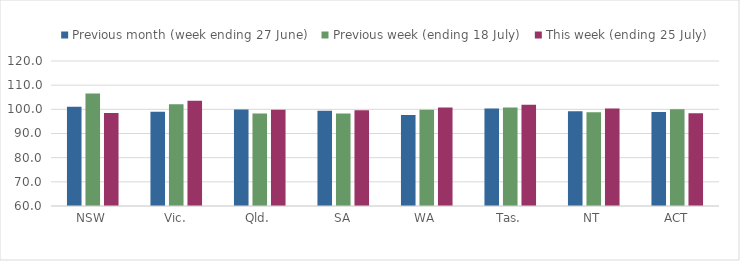
| Category | Previous month (week ending 27 June) | Previous week (ending 18 July) | This week (ending 25 July) |
|---|---|---|---|
| NSW | 101.058 | 106.523 | 98.513 |
| Vic. | 99.038 | 102.073 | 103.543 |
| Qld. | 99.903 | 98.263 | 99.855 |
| SA | 99.366 | 98.309 | 99.595 |
| WA | 97.618 | 99.86 | 100.785 |
| Tas. | 100.325 | 100.723 | 101.926 |
| NT | 99.259 | 98.795 | 100.298 |
| ACT | 98.943 | 100 | 98.334 |